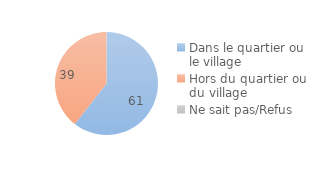
| Category | Series 0 |
|---|---|
| Dans le quartier ou le village | 60.559 |
| Hors du quartier ou du village | 39.392 |
| Ne sait pas/Refus | 0.049 |